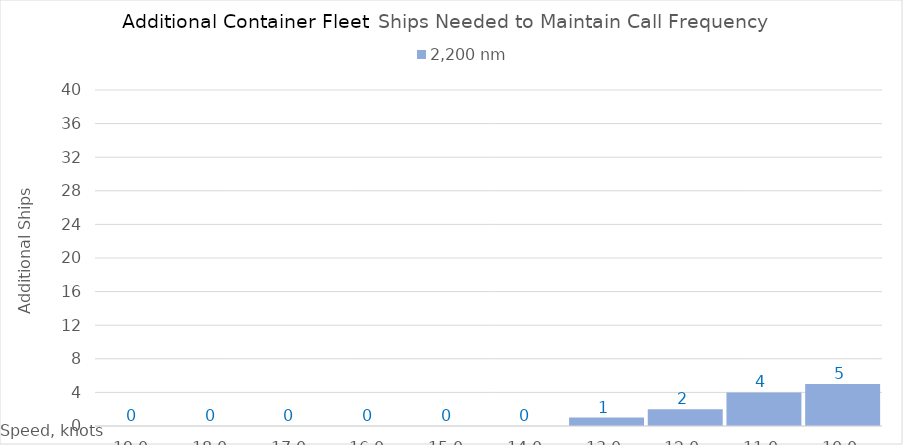
| Category | 2,200 |
|---|---|
| 19.0 | 0 |
| 18.0 | 0 |
| 17.0 | 0 |
| 16.0 | 0 |
| 15.0 | 0 |
| 14.0 | 0 |
| 13.0 | 1 |
| 12.0 | 2 |
| 11.0 | 4 |
| 10.0 | 5 |